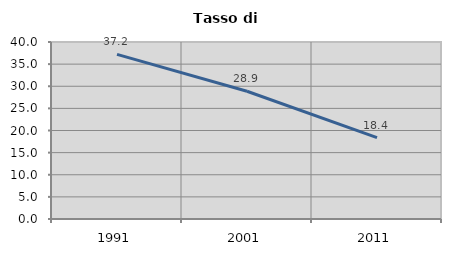
| Category | Tasso di disoccupazione   |
|---|---|
| 1991.0 | 37.194 |
| 2001.0 | 28.866 |
| 2011.0 | 18.399 |